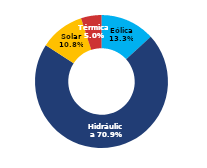
| Category | Sur |
|---|---|
| Eólica | 78.666 |
| Hidráulica | 420.058 |
| Solar | 64.08 |
| Térmica | 29.46 |